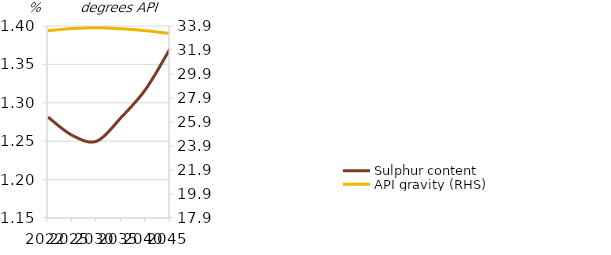
| Category | Sulphur content |
|---|---|
| 2022.0 | 1.281 |
| 2025.0 | 1.257 |
| 2030.0 | 1.25 |
| 2035.0 | 1.281 |
| 2040.0 | 1.317 |
| 2045.0 | 1.37 |